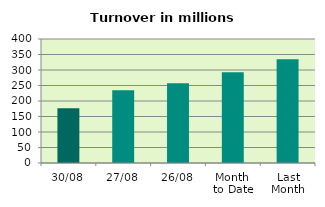
| Category | Series 0 |
|---|---|
| 30/08 | 176.668 |
| 27/08 | 234.478 |
| 26/08 | 257.646 |
| Month 
to Date | 292.916 |
| Last
Month | 334.97 |